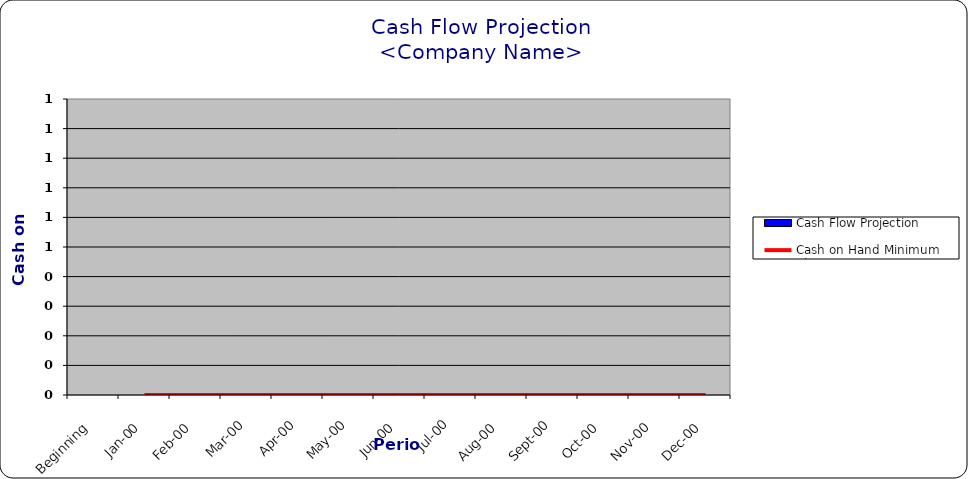
| Category | Cash Flow Projection |
|---|---|
| Beginning | 0 |
| Jan-00 | 0 |
| Feb-00 | 0 |
| Mar-00 | 0 |
| Apr-00 | 0 |
| May-00 | 0 |
| Jun-00 | 0 |
| Jul-00 | 0 |
| Aug-00 | 0 |
| Sep-00 | 0 |
| Oct-00 | 0 |
| Nov-00 | 0 |
| Dec-00 | 0 |